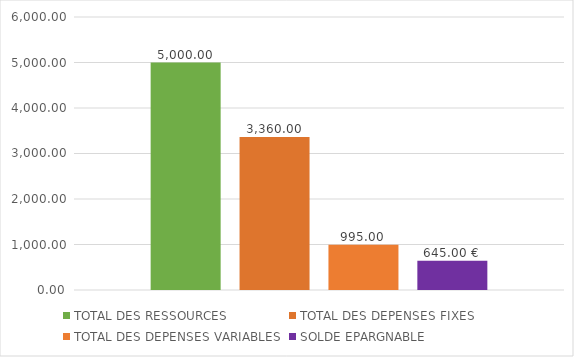
| Category | TOTAL DES RESSOURCES | TOTAL DES DEPENSES FIXES | TOTAL DES DEPENSES VARIABLES | SOLDE EPARGNABLE |
|---|---|---|---|---|
| 0 | 5000 | 3360 | 995 | 645 |